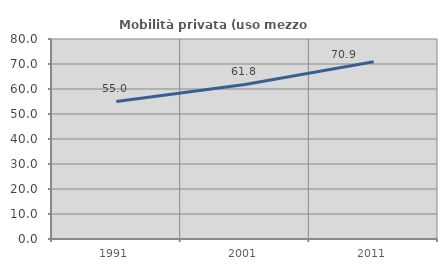
| Category | Mobilità privata (uso mezzo privato) |
|---|---|
| 1991.0 | 55.031 |
| 2001.0 | 61.833 |
| 2011.0 | 70.918 |